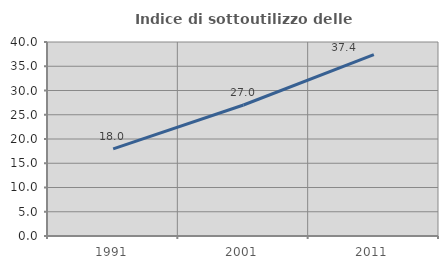
| Category | Indice di sottoutilizzo delle abitazioni  |
|---|---|
| 1991.0 | 17.957 |
| 2001.0 | 27.006 |
| 2011.0 | 37.385 |